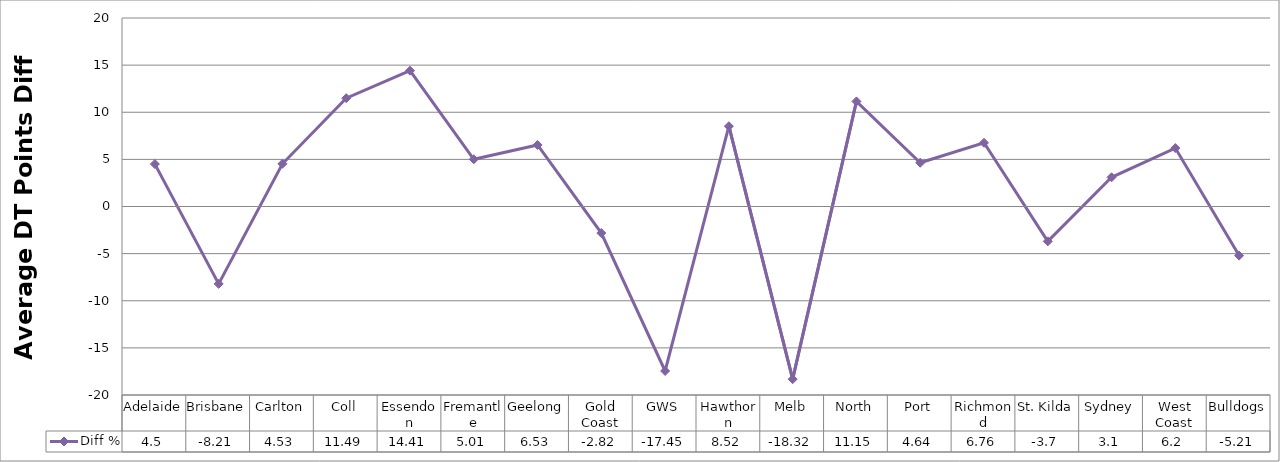
| Category | Diff % |
|---|---|
| Adelaide | 4.5 |
| Brisbane | -8.21 |
| Carlton | 4.53 |
| Coll | 11.49 |
| Essendon | 14.41 |
| Fremantle | 5.01 |
| Geelong | 6.53 |
| Gold Coast | -2.82 |
| GWS | -17.45 |
| Hawthorn | 8.52 |
| Melb | -18.32 |
| North | 11.15 |
| Port | 4.64 |
| Richmond | 6.76 |
| St. Kilda | -3.7 |
| Sydney | 3.1 |
| West Coast | 6.2 |
| Bulldogs | -5.21 |